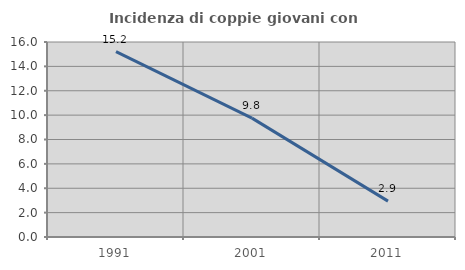
| Category | Incidenza di coppie giovani con figli |
|---|---|
| 1991.0 | 15.217 |
| 2001.0 | 9.756 |
| 2011.0 | 2.941 |